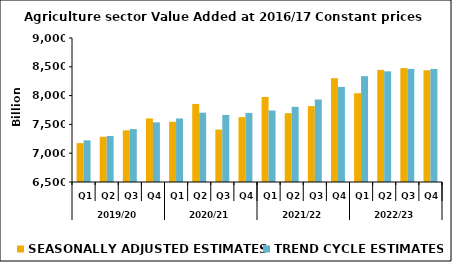
| Category | SEASONALLY ADJUSTED ESTIMATES | TREND CYCLE ESTIMATES |
|---|---|---|
| 0 | 7175.159 | 7222.967 |
| 1 | 7285.152 | 7298.217 |
| 2 | 7397.076 | 7418.53 |
| 3 | 7603.924 | 7535.173 |
| 4 | 7545.24 | 7603.295 |
| 5 | 7855.596 | 7703.79 |
| 6 | 7410.21 | 7664.458 |
| 7 | 7625.179 | 7699.358 |
| 8 | 7976.386 | 7740.519 |
| 9 | 7694.044 | 7804.677 |
| 10 | 7816.775 | 7932.554 |
| 11 | 8301.445 | 8150.976 |
| 12 | 8041.348 | 8337.09 |
| 13 | 8446.548 | 8421.526 |
| 14 | 8477.126 | 8464.173 |
| 15 | 8440.418 | 8463.602 |